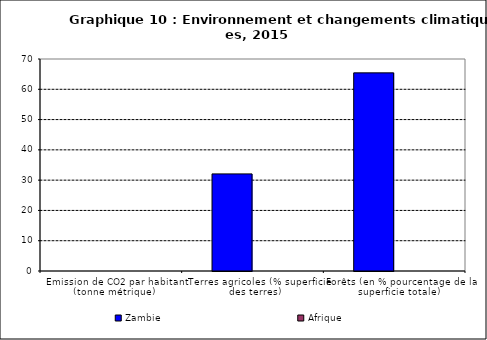
| Category | Zambie | Afrique |
|---|---|---|
| Emission de CO2 par habitant (tonne métrique) | 0 | 0 |
| Terres agricoles (% superficie des terres) | 32.064 | 0 |
| Forêts (en % pourcentage de la superficie totale) | 65.423 | 0 |